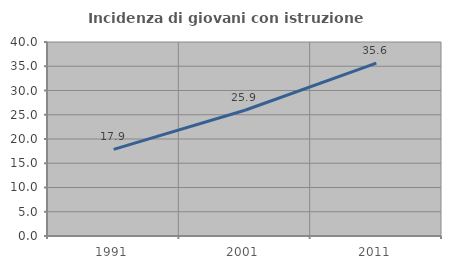
| Category | Incidenza di giovani con istruzione universitaria |
|---|---|
| 1991.0 | 17.855 |
| 2001.0 | 25.922 |
| 2011.0 | 35.649 |